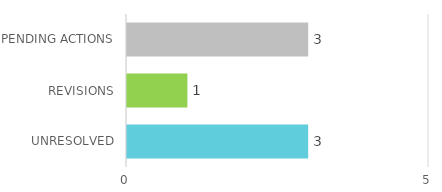
| Category | Series 1 |
|---|---|
| UNRESOLVED | 3 |
| REVISIONS | 1 |
| PENDING ACTIONS | 3 |